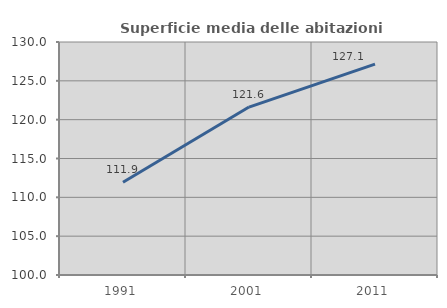
| Category | Superficie media delle abitazioni occupate |
|---|---|
| 1991.0 | 111.936 |
| 2001.0 | 121.624 |
| 2011.0 | 127.15 |